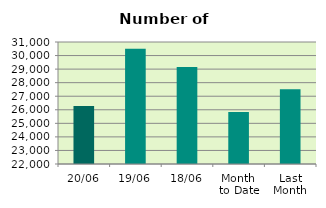
| Category | Series 0 |
|---|---|
| 20/06 | 26284 |
| 19/06 | 30504 |
| 18/06 | 29164 |
| Month 
to Date | 25835.286 |
| Last
Month | 27522.455 |